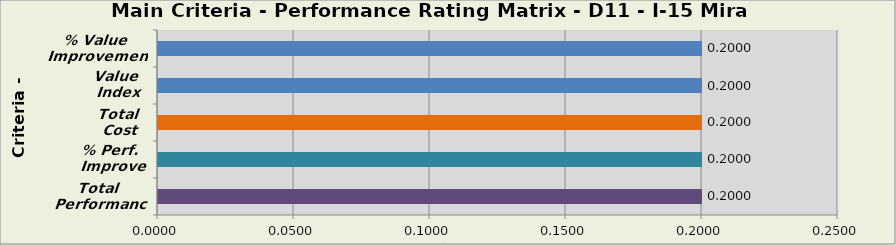
| Category | Total 
Performance % Perf. 
Improve Total 
Cost Value 
Index % Value 
Improvement |
|---|---|
| Total 
Performance | 0.2 |
| % Perf. 
Improve | 0.2 |
| Total 
Cost | 0.2 |
| Value 
Index | 0.2 |
| % Value 
Improvement | 0.2 |